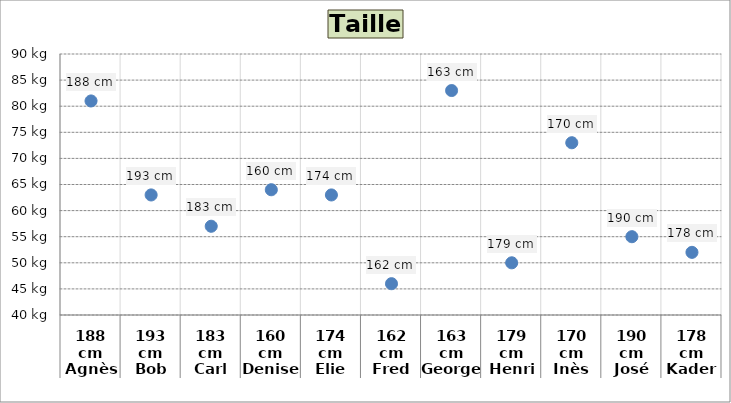
| Category | Poids |
|---|---|
| 0 | 81 |
| 1 | 63 |
| 2 | 57 |
| 3 | 64 |
| 4 | 63 |
| 5 | 46 |
| 6 | 83 |
| 7 | 50 |
| 8 | 73 |
| 9 | 55 |
| 10 | 52 |